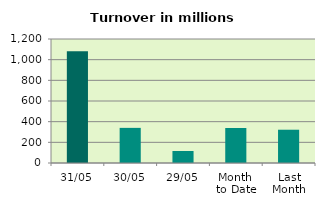
| Category | Series 0 |
|---|---|
| 31/05 | 1080.623 |
| 30/05 | 339.947 |
| 29/05 | 115.94 |
| Month 
to Date | 338.969 |
| Last
Month | 322.024 |